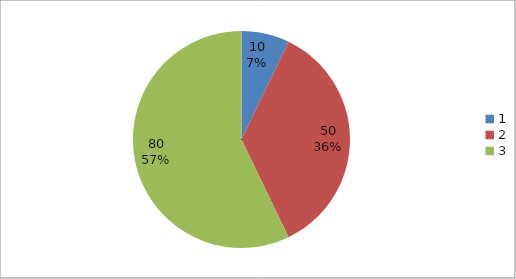
| Category | Series 0 |
|---|---|
| 0 | 10 |
| 1 | 50 |
| 2 | 80 |